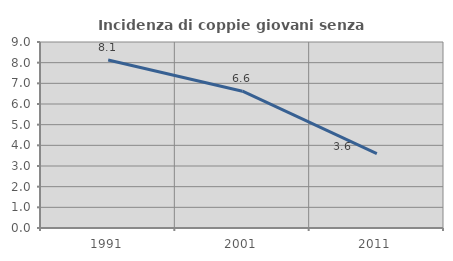
| Category | Incidenza di coppie giovani senza figli |
|---|---|
| 1991.0 | 8.132 |
| 2001.0 | 6.621 |
| 2011.0 | 3.598 |